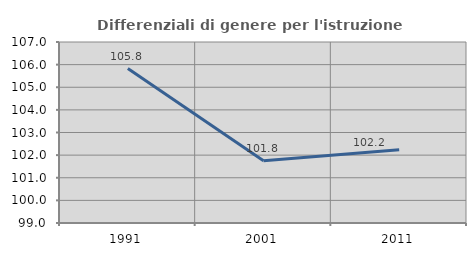
| Category | Differenziali di genere per l'istruzione superiore |
|---|---|
| 1991.0 | 105.827 |
| 2001.0 | 101.753 |
| 2011.0 | 102.238 |